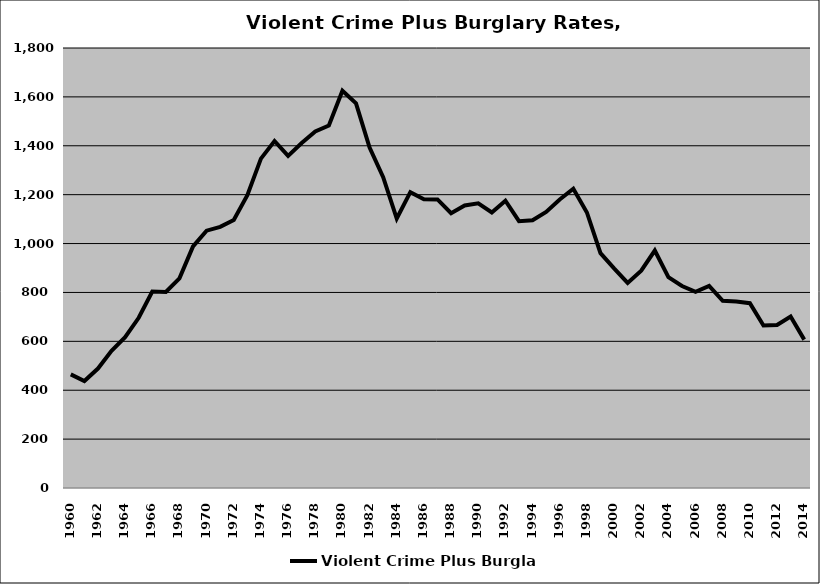
| Category | Violent Crime Plus Burglary |
|---|---|
| 1960.0 | 464.729 |
| 1961.0 | 437.664 |
| 1962.0 | 488.521 |
| 1963.0 | 560.936 |
| 1964.0 | 617.036 |
| 1965.0 | 696.364 |
| 1966.0 | 803.571 |
| 1967.0 | 802.148 |
| 1968.0 | 857.447 |
| 1969.0 | 988.23 |
| 1970.0 | 1052.703 |
| 1971.0 | 1068.426 |
| 1972.0 | 1096.448 |
| 1973.0 | 1197.753 |
| 1974.0 | 1347.485 |
| 1975.0 | 1419.569 |
| 1976.0 | 1358.469 |
| 1977.0 | 1411.593 |
| 1978.0 | 1458.914 |
| 1979.0 | 1483.029 |
| 1980.0 | 1625.25 |
| 1981.0 | 1573.417 |
| 1982.0 | 1392.664 |
| 1983.0 | 1271.773 |
| 1984.0 | 1102.361 |
| 1985.0 | 1210.274 |
| 1986.0 | 1181.622 |
| 1987.0 | 1180.714 |
| 1988.0 | 1124.069 |
| 1989.0 | 1155.712 |
| 1990.0 | 1164.582 |
| 1991.0 | 1127.062 |
| 1992.0 | 1175.51 |
| 1993.0 | 1091.774 |
| 1994.0 | 1095.335 |
| 1995.0 | 1129.575 |
| 1996.0 | 1180.15 |
| 1997.0 | 1224.526 |
| 1998.0 | 1127.095 |
| 1999.0 | 960.684 |
| 2000.0 | 898.23 |
| 2001.0 | 838.983 |
| 2002.0 | 888.912 |
| 2003.0 | 971.464 |
| 2004.0 | 862.227 |
| 2005.0 | 826.516 |
| 2006.0 | 802.098 |
| 2007.0 | 826.286 |
| 2008.0 | 765.727 |
| 2009.0 | 763.349 |
| 2010.0 | 756.037 |
| 2011.0 | 665.057 |
| 2012.0 | 666.72 |
| 2013.0 | 701.774 |
| 2014.0 | 607.02 |